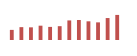
| Category | Importações (2) |
|---|---|
| 0 | 63256.661 |
| 1 | 80362.628 |
| 2 | 79098.748 |
| 3 | 89493.365 |
| 4 | 81914.569 |
| 5 | 86371.3 |
| 6 | 122399.001 |
| 7 | 125153.991 |
| 8 | 116754.909 |
| 9 | 110190.536 |
| 10 | 137205.926 |
| 11 | 156718.632 |